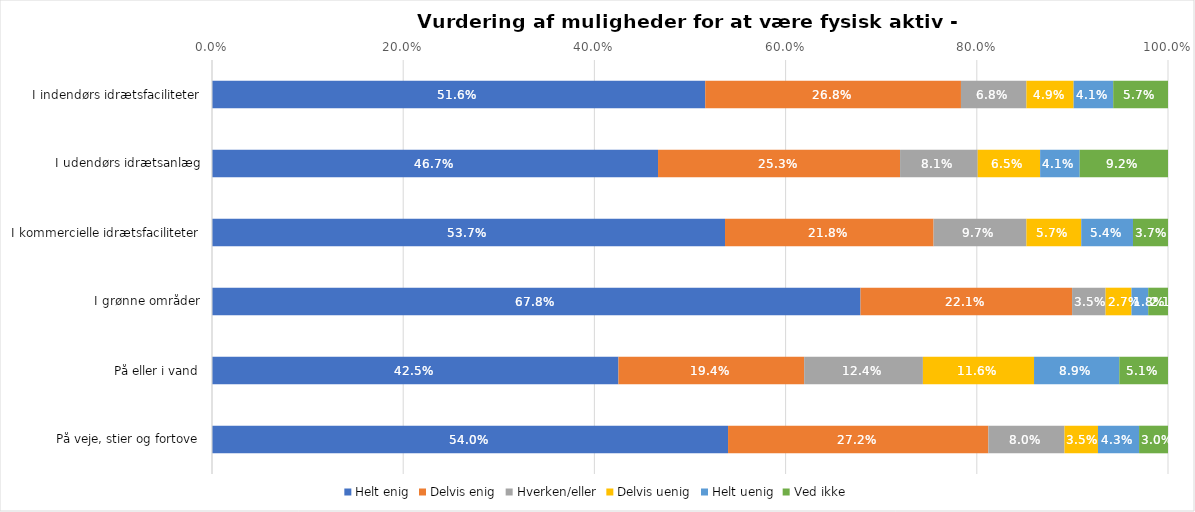
| Category | Helt enig | Delvis enig | Hverken/eller | Delvis uenig | Helt uenig | Ved ikke |
|---|---|---|---|---|---|---|
| I indendørs idrætsfaciliteter | 0.516 | 0.268 | 0.068 | 0.049 | 0.041 | 0.057 |
| I udendørs idrætsanlæg | 0.467 | 0.253 | 0.081 | 0.065 | 0.041 | 0.092 |
| I kommercielle idrætsfaciliteter | 0.537 | 0.218 | 0.097 | 0.057 | 0.054 | 0.037 |
| I grønne områder | 0.678 | 0.221 | 0.035 | 0.027 | 0.018 | 0.021 |
| På eller i vand | 0.425 | 0.194 | 0.124 | 0.116 | 0.089 | 0.051 |
| På veje, stier og fortove | 0.54 | 0.272 | 0.08 | 0.035 | 0.043 | 0.03 |